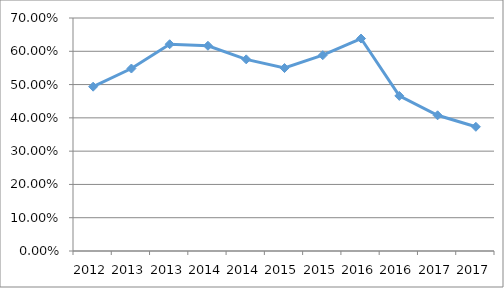
| Category | FIS1-N1O21 |
|---|---|
| 2012.0 | 0.494 |
| 2013.0 | 0.548 |
| 2013.0 | 0.621 |
| 2014.0 | 0.617 |
| 2014.0 | 0.576 |
| 2015.0 | 0.55 |
| 2015.0 | 0.588 |
| 2016.0 | 0.638 |
| 2016.0 | 0.466 |
| 2017.0 | 0.408 |
| 2017.0 | 0.373 |